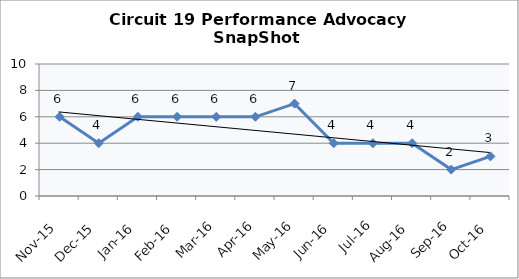
| Category | Circuit 19 |
|---|---|
| Nov-15 | 6 |
| Dec-15 | 4 |
| Jan-16 | 6 |
| Feb-16 | 6 |
| Mar-16 | 6 |
| Apr-16 | 6 |
| May-16 | 7 |
| Jun-16 | 4 |
| Jul-16 | 4 |
| Aug-16 | 4 |
| Sep-16 | 2 |
| Oct-16 | 3 |